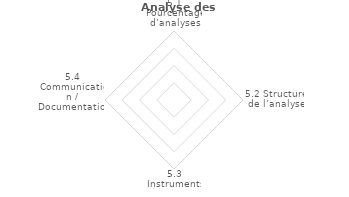
| Category | Series 2 |
|---|---|
| 5.1 Pourcentage d’analyses | 0 |
| 5.2 Structure de l’analyse | 0 |
| 5.3 Instruments | 0 |
| 5.4 Communication / Documentation | 0 |